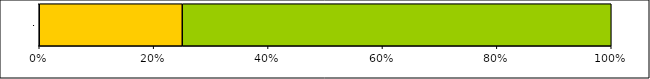
| Category | Series 0 | Series 1 | Series 2 | Series 3 |
|---|---|---|---|---|
| 0 | 0 | 1 | 3 | 0 |